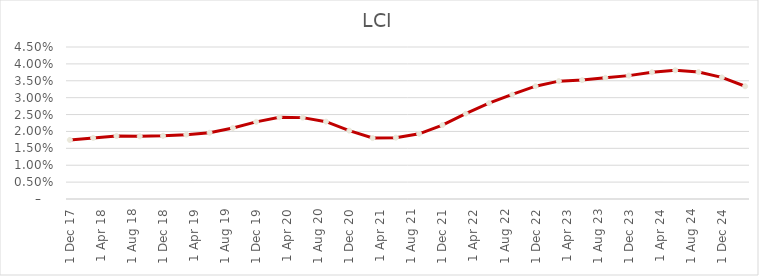
| Category | Series 0 |
|---|---|
| 2017-12-31 | 0.017 |
| 2018-03-31 | 0.018 |
| 2018-06-30 | 0.019 |
| 2018-09-30 | 0.019 |
| 2018-12-31 | 0.019 |
| 2019-03-31 | 0.019 |
| 2019-06-30 | 0.02 |
| 2019-09-30 | 0.021 |
| 2019-12-31 | 0.023 |
| 2020-03-31 | 0.024 |
| 2020-06-30 | 0.024 |
| 2020-09-30 | 0.023 |
| 2020-12-31 | 0.02 |
| 2021-03-31 | 0.018 |
| 2021-06-30 | 0.018 |
| 2021-09-30 | 0.019 |
| 2021-12-31 | 0.022 |
| 2022-03-31 | 0.025 |
| 2022-06-30 | 0.028 |
| 2022-09-30 | 0.031 |
| 2022-12-31 | 0.033 |
| 2023-03-31 | 0.035 |
| 2023-06-30 | 0.035 |
| 2023-09-30 | 0.036 |
| 2023-12-31 | 0.037 |
| 2024-03-31 | 0.038 |
| 2024-06-30 | 0.038 |
| 2024-09-30 | 0.038 |
| 2024-12-31 | 0.036 |
| 2025-03-31 | 0.033 |